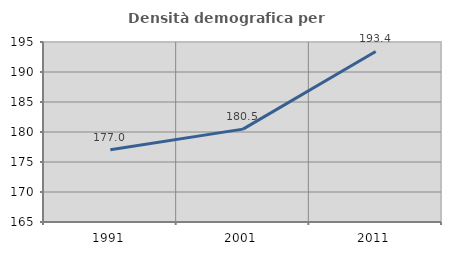
| Category | Densità demografica |
|---|---|
| 1991.0 | 177.043 |
| 2001.0 | 180.478 |
| 2011.0 | 193.426 |